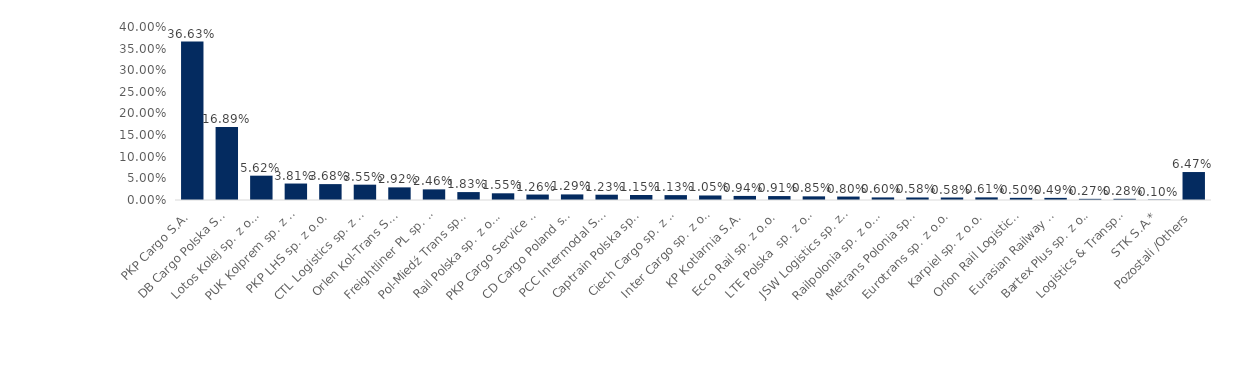
| Category | Series 0 |
|---|---|
| PKP Cargo S.A. | 0.366 |
| DB Cargo Polska S.A. | 0.169 |
| Lotos Kolej sp. z o.o. | 0.056 |
| PUK Kolprem sp. z o.o. | 0.038 |
| PKP LHS sp. z o.o. | 0.037 |
| CTL Logistics sp. z o.o. | 0.035 |
| Orlen Kol-Trans S.A. | 0.029 |
| Freightliner PL sp. z o.o. | 0.025 |
| Pol-Miedź Trans sp. z o.o. | 0.018 |
| Rail Polska sp. z o.o. | 0.016 |
| PKP Cargo Service sp. z o.o. | 0.013 |
| CD Cargo Poland sp. z o.o. | 0.013 |
| PCC Intermodal S.A. | 0.012 |
| Captrain Polska sp.  z o.o. | 0.012 |
| Ciech Cargo sp. z o.o. | 0.011 |
| Inter Cargo sp. z o.o. | 0.01 |
| KP Kotlarnia S.A. | 0.009 |
| Ecco Rail sp. z o.o. | 0.009 |
| LTE Polska  sp. z o.o. | 0.008 |
| JSW Logistics sp. z o. o. | 0.008 |
| Railpolonia sp. z o.o. | 0.006 |
| Metrans Polonia sp. z o.o. | 0.006 |
| Eurotrans sp. z o.o. | 0.006 |
| Karpiel sp. z o.o. | 0.006 |
| Orion Rail Logistics sp. z o.o. | 0.005 |
| Eurasian Railway Carrier sp. z o.o. | 0.005 |
| Bartex Plus sp. z o.o. | 0.003 |
| Logistics & Transport Company sp. z o.o. | 0.003 |
| STK S.A.* | 0.001 |
| Pozostali /Others | 0.065 |